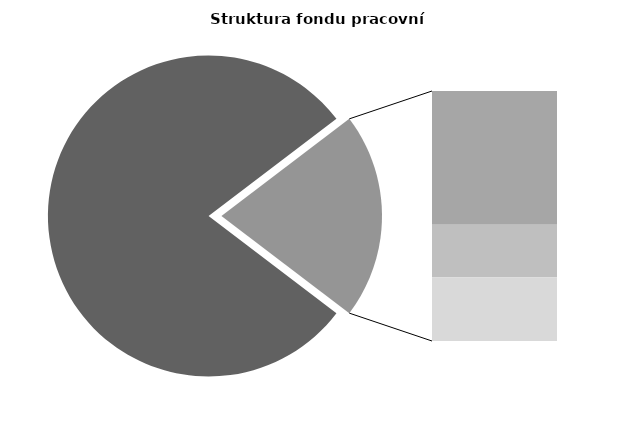
| Category | Series 0 |
|---|---|
| Průměrná měsíční odpracovaná doba bez přesčasu | 135.85 |
| Dovolená | 18.959 |
| Nemoc | 7.442 |
| Jiné | 9.016 |